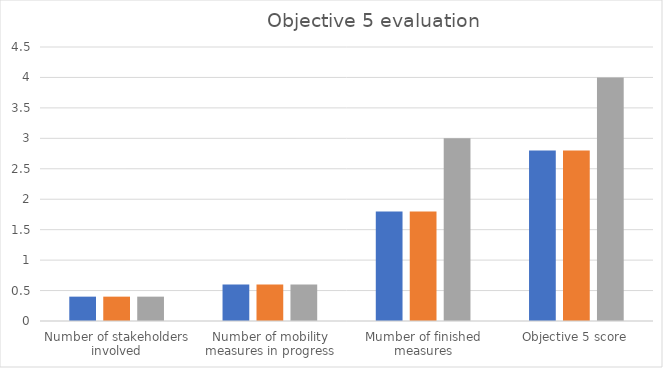
| Category | Option 1 | Option 2 | Option 3 |
|---|---|---|---|
| Number of stakeholders involved | 0.4 | 0.4 | 0.4 |
| Number of mobility measures in progress | 0.6 | 0.6 | 0.6 |
| Mumber of finished measures | 1.8 | 1.8 | 3 |
| Objective 5 score | 2.8 | 2.8 | 4 |